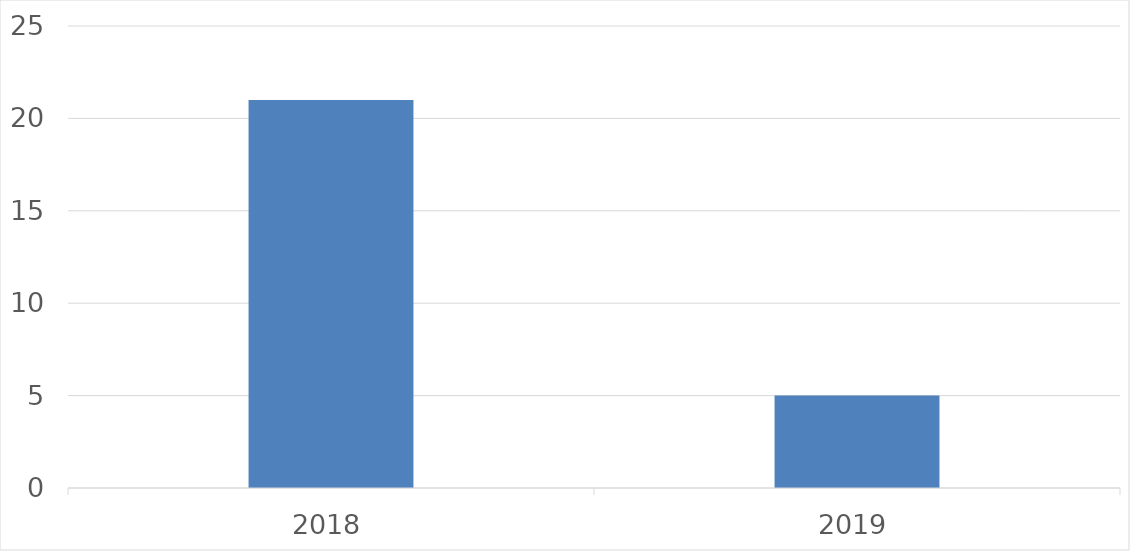
| Category | Series 0 |
|---|---|
| 2018 | 21 |
| 2019 | 5 |